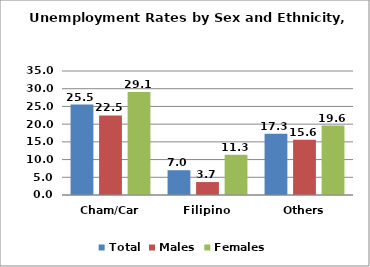
| Category | Total | Males | Females |
|---|---|---|---|
| Cham/Car | 25.543 | 22.471 | 29.063 |
| Filipino | 6.997 | 3.655 | 11.347 |
| Others | 17.283 | 15.608 | 19.612 |